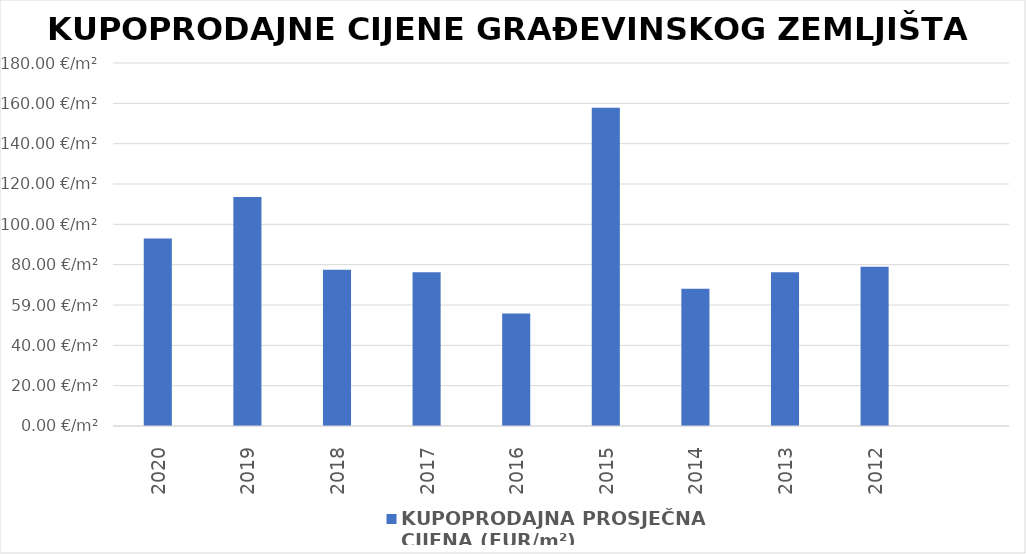
| Category | KUPOPRODAJNA PROSJEČNA 
CIJENA (EUR/m²) |
|---|---|
| 2020 | 1900-04-01 22:24:29 |
| 2019 | 1900-04-22 12:07:51 |
| 2018 | 1900-03-17 10:22:14 |
| 2017 | 1900-03-16 06:19:16 |
| 2016 | 1900-02-24 19:31:05 |
| 2015 | 1900-06-05 17:59:41 |
| 2014 | 1900-03-08 02:46:04 |
| 2013 | 1900-03-16 05:45:35 |
| 2012 | 1900-03-19 00:13:09 |